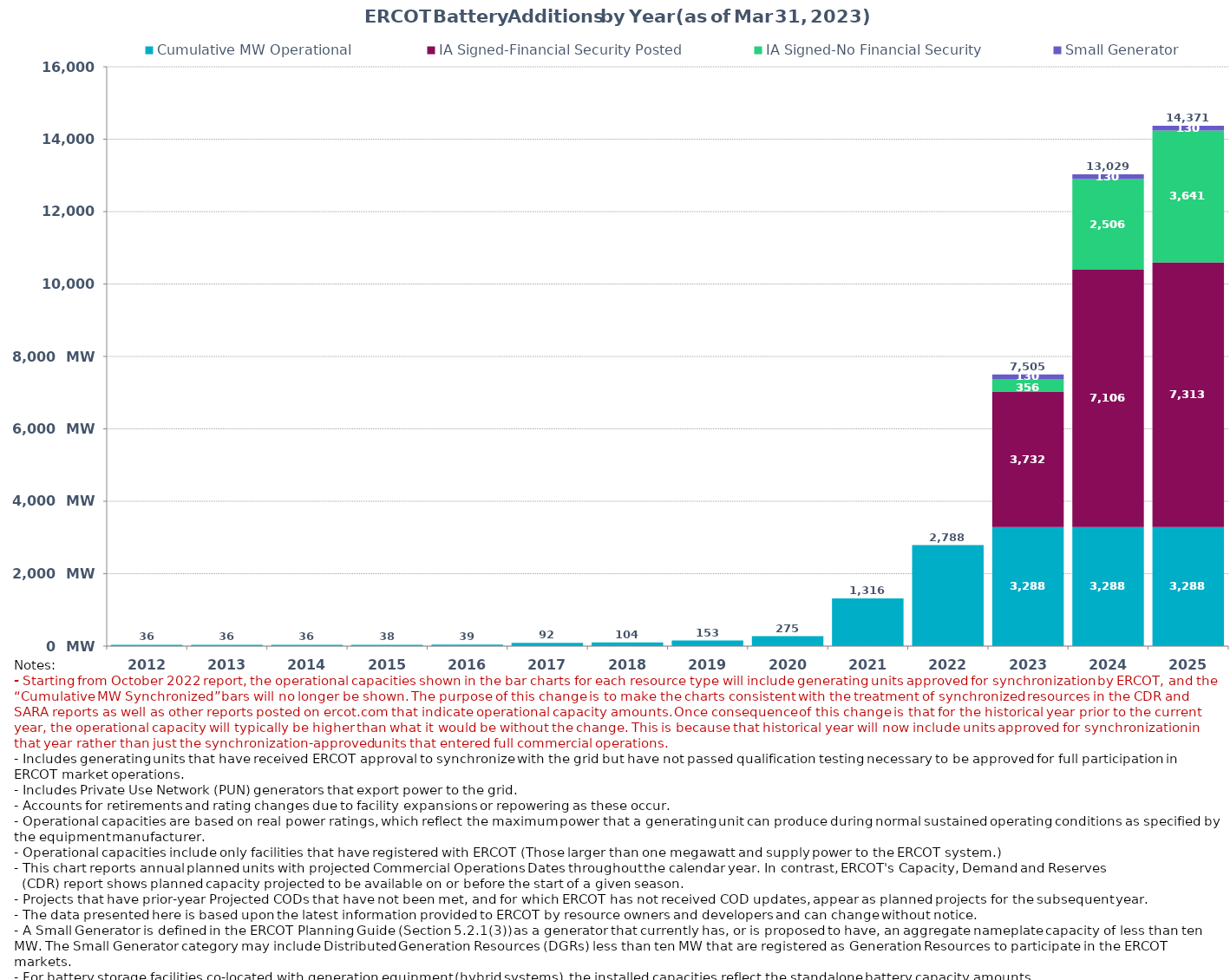
| Category | Cumulative MW Operational  | IA Signed-Financial Security Posted  | IA Signed-No Financial Security  | Small Generator | Cumulative Installed and Planned |
|---|---|---|---|---|---|
| 2012.0 | 36 | 0 | 0 | 0 | 36 |
| 2013.0 | 36 | 0 | 0 | 0 | 36 |
| 2014.0 | 36 | 0 | 0 | 0 | 36 |
| 2015.0 | 38 | 0 | 0 | 0 | 38 |
| 2016.0 | 39 | 0 | 0 | 0 | 39 |
| 2017.0 | 92.3 | 0 | 0 | 0 | 92.3 |
| 2018.0 | 103.7 | 0 | 0 | 0 | 103.7 |
| 2019.0 | 153.3 | 0 | 0 | 0 | 153.3 |
| 2020.0 | 275.4 | 0 | 0 | 0 | 275.4 |
| 2021.0 | 1316.43 | 0 | 0 | 0 | 1316.43 |
| 2022.0 | 2787.86 | 0 | 0 | 0 | 2787.86 |
| 2023.0 | 3287.56 | 3731.77 | 356.21 | 129.75 | 7505.29 |
| 2024.0 | 3287.56 | 7105.92 | 2506.22 | 129.75 | 13029.45 |
| 2025.0 | 3287.56 | 7312.84 | 3641.28 | 129.75 | 14371.43 |